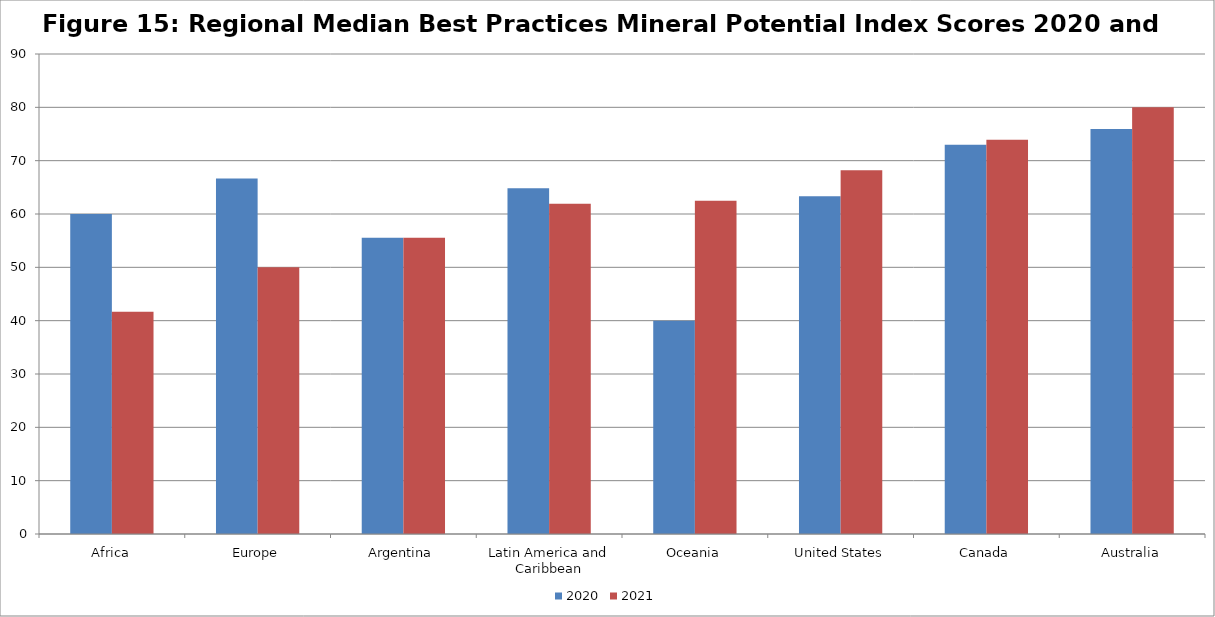
| Category | 2020 | 2021 |
|---|---|---|
| Africa | 60 | 41.667 |
| Europe | 66.667 | 50 |
| Argentina | 55.556 | 55.556 |
| Latin America and Caribbean | 64.815 | 61.905 |
| Oceania | 40 | 62.5 |
| United States | 63.333 | 68.182 |
| Canada | 72.999 | 73.9 |
| Australia | 75.926 | 80 |